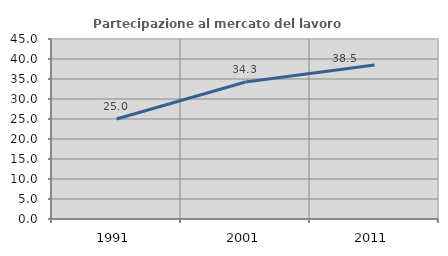
| Category | Partecipazione al mercato del lavoro  femminile |
|---|---|
| 1991.0 | 25 |
| 2001.0 | 34.264 |
| 2011.0 | 38.485 |